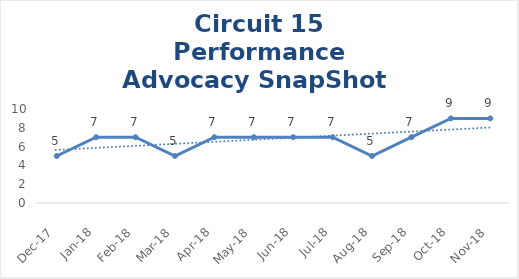
| Category | Circuit 15 |
|---|---|
| Dec-17 | 5 |
| Jan-18 | 7 |
| Feb-18 | 7 |
| Mar-18 | 5 |
| Apr-18 | 7 |
| May-18 | 7 |
| Jun-18 | 7 |
| Jul-18 | 7 |
| Aug-18 | 5 |
| Sep-18 | 7 |
| Oct-18 | 9 |
| Nov-18 | 9 |